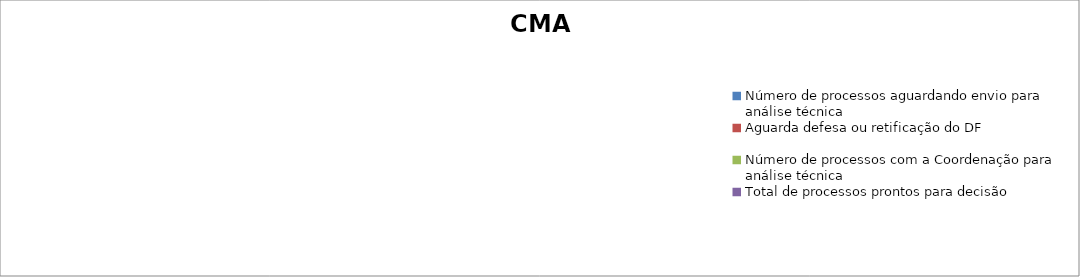
| Category | CMA |
|---|---|
| Número de processos aguardando envio para análise técnica | 0 |
| Aguarda defesa ou retificação do DF | 0 |
| Número de processos com a Coordenação para análise técnica | 0 |
| Total de processos prontos para decisão | 0 |